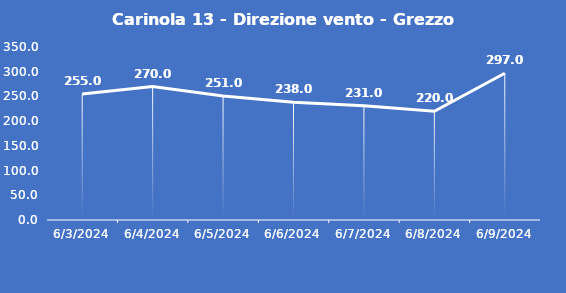
| Category | Carinola 13 - Direzione vento - Grezzo (°N) |
|---|---|
| 6/3/24 | 255 |
| 6/4/24 | 270 |
| 6/5/24 | 251 |
| 6/6/24 | 238 |
| 6/7/24 | 231 |
| 6/8/24 | 220 |
| 6/9/24 | 297 |